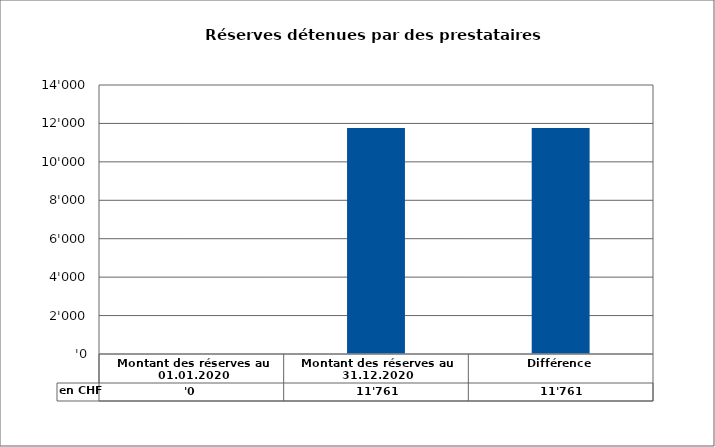
| Category | en CHF |
|---|---|
| Montant des réserves au 01.01.2020 | 0 |
| Montant des réserves au 31.12.2020 | 11761 |
| Différence | 11761 |